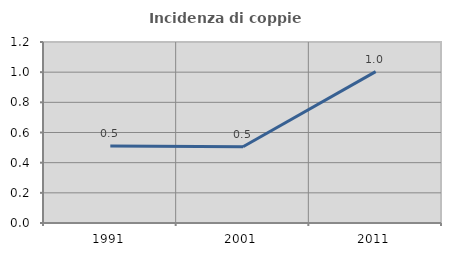
| Category | Incidenza di coppie miste |
|---|---|
| 1991.0 | 0.51 |
| 2001.0 | 0.505 |
| 2011.0 | 1.003 |